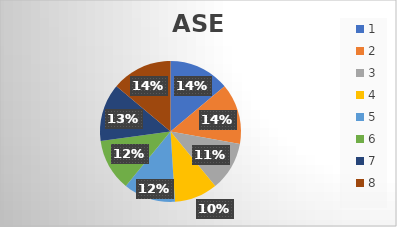
| Category | ASE JOVENES  |
|---|---|
| 0 | 21 |
| 1 | 21 |
| 2 | 17 |
| 3 | 15 |
| 4 | 18 |
| 5 | 18 |
| 6 | 20 |
| 7 | 21 |